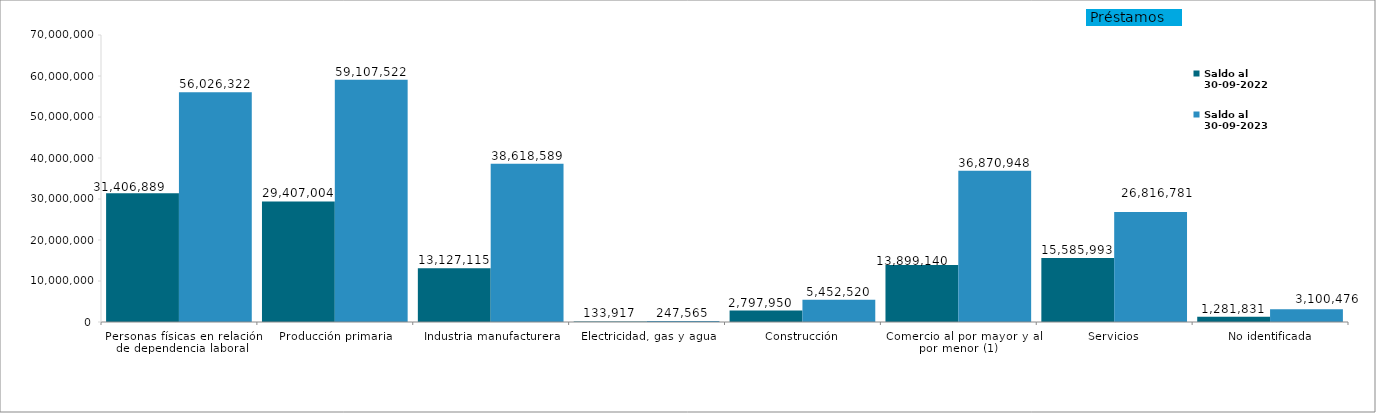
| Category | Saldo al
30-09-2022 | Saldo al
30-09-2023 |
|---|---|---|
| Personas físicas en relación de dependencia laboral | 31406889 | 56026322 |
| Producción primaria | 29407004 | 59107522 |
| Industria manufacturera | 13127115 | 38618589 |
| Electricidad, gas y agua | 133917 | 247565 |
| Construcción | 2797950 | 5452520 |
| Comercio al por mayor y al por menor (1)  | 13899140 | 36870948 |
| Servicios | 15585993 | 26816781 |
| No identificada | 1281831 | 3100476 |